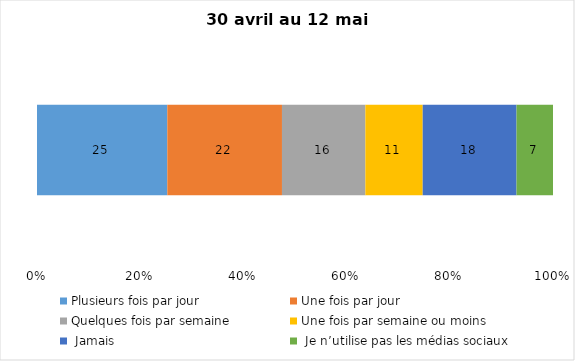
| Category | Plusieurs fois par jour | Une fois par jour | Quelques fois par semaine   | Une fois par semaine ou moins   |  Jamais   |  Je n’utilise pas les médias sociaux |
|---|---|---|---|---|---|---|
| 0 | 25 | 22 | 16 | 11 | 18 | 7 |